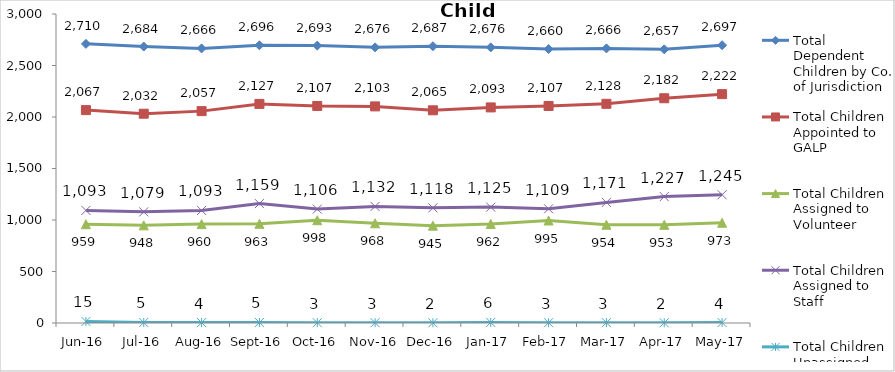
| Category | Total Dependent Children by Co. of Jurisdiction | Total Children Appointed to GALP | Total Children Assigned to Volunteer | Total Children Assigned to Staff | Total Children Unassigned |
|---|---|---|---|---|---|
| Jun-16 | 2710 | 2067 | 959 | 1093 | 15 |
| Jul-16 | 2684 | 2032 | 948 | 1079 | 5 |
| Aug-16 | 2666 | 2057 | 960 | 1093 | 4 |
| Sep-16 | 2696 | 2127 | 963 | 1159 | 5 |
| Oct-16 | 2693 | 2107 | 998 | 1106 | 3 |
| Nov-16 | 2676 | 2103 | 968 | 1132 | 3 |
| Dec-16 | 2687 | 2065 | 945 | 1118 | 2 |
| Jan-17 | 2676 | 2093 | 962 | 1125 | 6 |
| Feb-17 | 2660 | 2107 | 995 | 1109 | 3 |
| Mar-17 | 2666 | 2128 | 954 | 1171 | 3 |
| Apr-17 | 2657 | 2182 | 953 | 1227 | 2 |
| May-17 | 2697 | 2222 | 973 | 1245 | 4 |